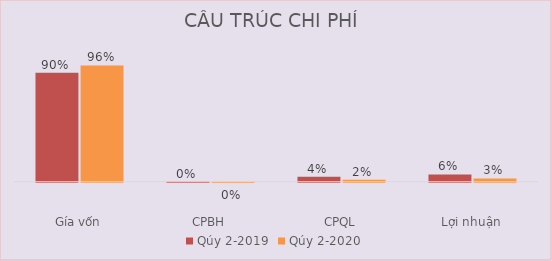
| Category | Qúy 2-2019 | Qúy 2-2020 |
|---|---|---|
| Gía vốn | 0.898 | 0.958 |
| CPBH | 0.001 | 0 |
| CPQL | 0.041 | 0.016 |
| Lợi nhuận | 0.06 | 0.027 |